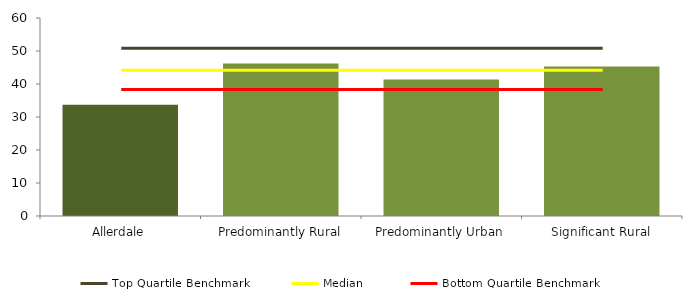
| Category | Series 0 |
|---|---|
| Allerdale | 33.7 |
| Predominantly Rural | 46.228 |
| Predominantly Urban | 41.365 |
| Significant Rural | 45.329 |